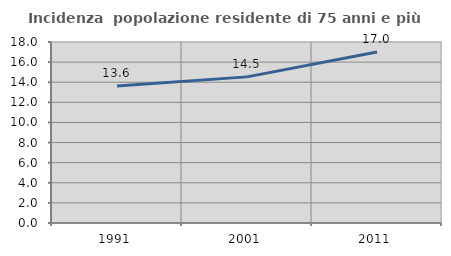
| Category | Incidenza  popolazione residente di 75 anni e più |
|---|---|
| 1991.0 | 13.626 |
| 2001.0 | 14.532 |
| 2011.0 | 17.003 |